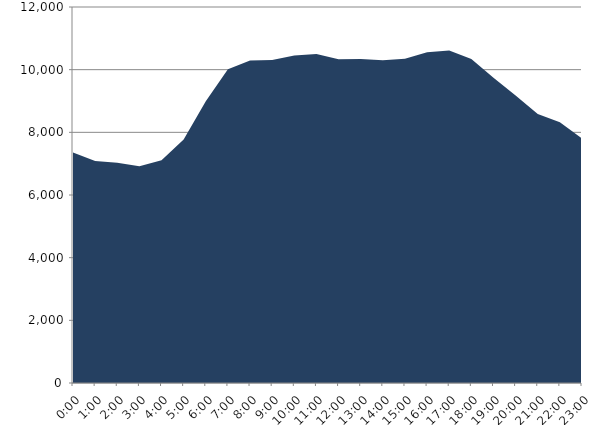
| Category | Series 0 | Series 1 |
|---|---|---|
| 2019-11-20 |  | 7358.06 |
| 2019-11-20 01:00:00 |  | 7084.73 |
| 2019-11-20 02:00:00 |  | 7031.98 |
| 2019-11-20 03:00:00 |  | 6916.34 |
| 2019-11-20 04:00:00 |  | 7112.19 |
| 2019-11-20 05:00:00 |  | 7770.97 |
| 2019-11-20 06:00:00 |  | 8994.18 |
| 2019-11-20 07:00:00 |  | 10010.86 |
| 2019-11-20 08:00:00 |  | 10296.4 |
| 2019-11-20 09:00:00 |  | 10306.34 |
| 2019-11-20 10:00:00 |  | 10451.22 |
| 2019-11-20 11:00:00 |  | 10498.96 |
| 2019-11-20 12:00:00 |  | 10335.29 |
| 2019-11-20 13:00:00 |  | 10342.65 |
| 2019-11-20 14:00:00 |  | 10299.59 |
| 2019-11-20 15:00:00 |  | 10347.95 |
| 2019-11-20 16:00:00 |  | 10559.24 |
| 2019-11-20 17:00:00 |  | 10610.34 |
| 2019-11-20 18:00:00 |  | 10338.65 |
| 2019-11-20 19:00:00 |  | 9738.7 |
| 2019-11-20 20:00:00 |  | 9176.95 |
| 2019-11-20 21:00:00 |  | 8585.05 |
| 2019-11-20 22:00:00 |  | 8322.76 |
| 2019-11-20 23:00:00 |  | 7806.18 |